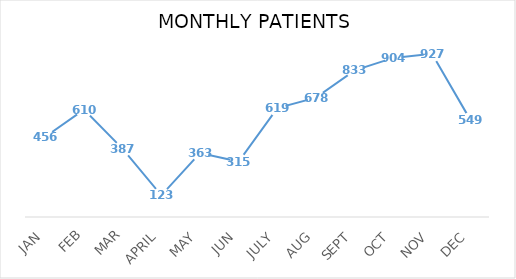
| Category |  Nº. PATIENTS |
|---|---|
| JAN | 456 |
| FEB | 610 |
| MAR | 387 |
| APRIL | 123 |
| MAY | 363 |
| JUN | 315 |
| JULY | 619 |
| AUG | 678 |
| SEPT | 833 |
| OCT | 904 |
| NOV | 927 |
| DEC | 549 |